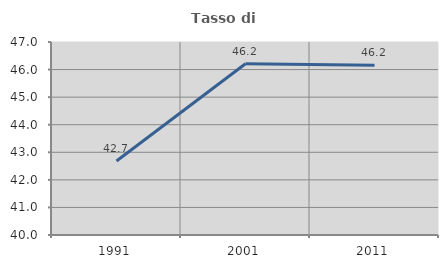
| Category | Tasso di occupazione   |
|---|---|
| 1991.0 | 42.686 |
| 2001.0 | 46.209 |
| 2011.0 | 46.154 |